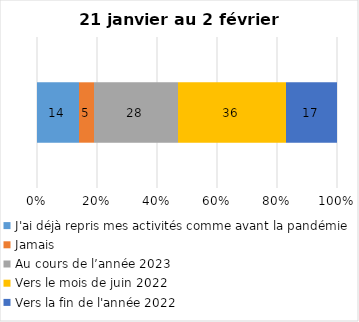
| Category | J'ai déjà repris mes activités comme avant la pandémie | Jamais | Au cours de l’année 2023 | Vers le mois de juin 2022 | Vers la fin de l'année 2022 |
|---|---|---|---|---|---|
| 0 | 14 | 5 | 28 | 36 | 17 |